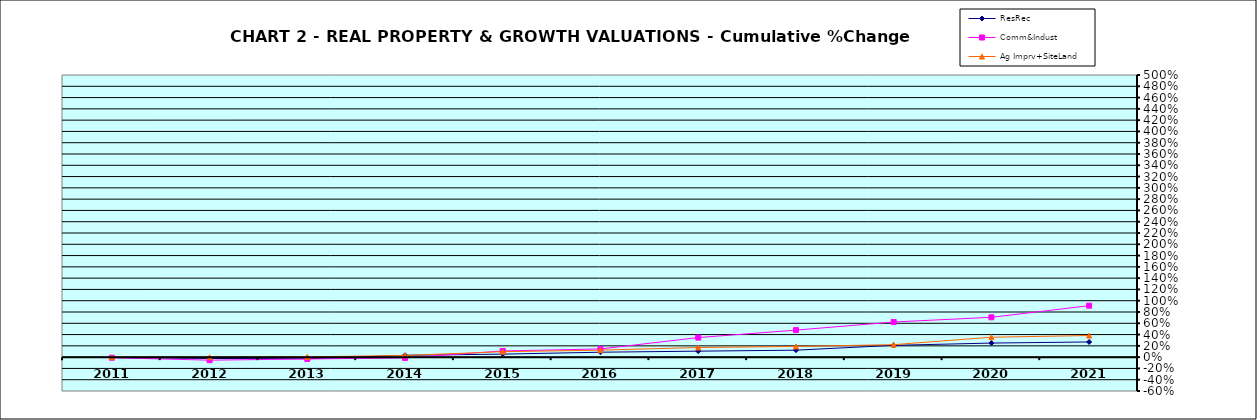
| Category | ResRec | Comm&Indust | Ag Imprv+SiteLand |
|---|---|---|---|
| 2011.0 | -0.007 | -0.01 | 0 |
| 2012.0 | -0.024 | -0.054 | -0.001 |
| 2013.0 | -0.028 | -0.032 | 0.005 |
| 2014.0 | 0.033 | -0.014 | 0.03 |
| 2015.0 | 0.053 | 0.11 | 0.097 |
| 2016.0 | 0.087 | 0.145 | 0.124 |
| 2017.0 | 0.106 | 0.347 | 0.171 |
| 2018.0 | 0.123 | 0.479 | 0.19 |
| 2019.0 | 0.209 | 0.623 | 0.221 |
| 2020.0 | 0.249 | 0.706 | 0.353 |
| 2021.0 | 0.269 | 0.912 | 0.383 |